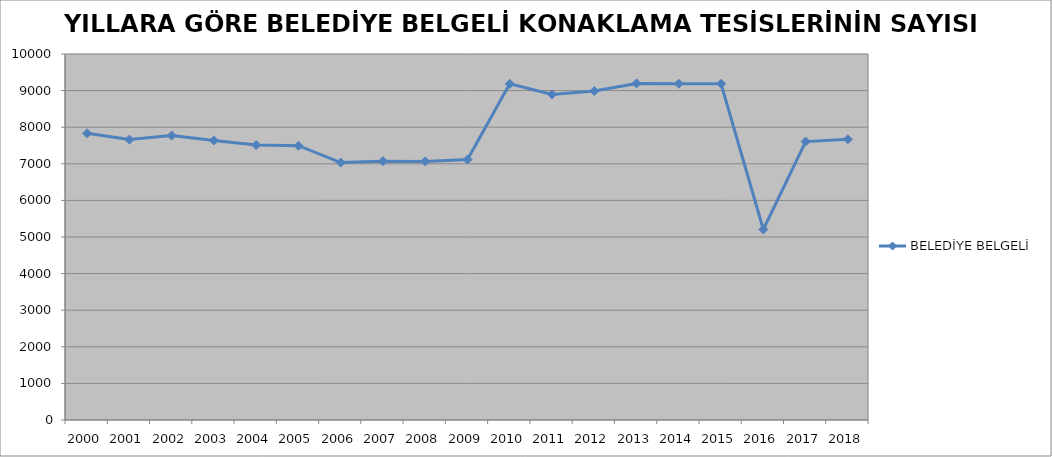
| Category | BELEDİYE BELGELİ |
|---|---|
| 2000 | 7832 |
| 2001 | 7661 |
| 2002 | 7772 |
| 2003 | 7637 |
| 2004 | 7514 |
| 2005 | 7494 |
| 2006 | 7033 |
| 2007 | 7073 |
| 2008 | 7064 |
| 2009 | 7115 |
| 2010 | 9185 |
| 2011 | 8893 |
| 2012 | 8988 |
| 2013 | 9196 |
| 2014 | 9188 |
| 2015 | 9187 |
| 2016 | 5206 |
| 2017 | 7607 |
| 2018 | 7671 |